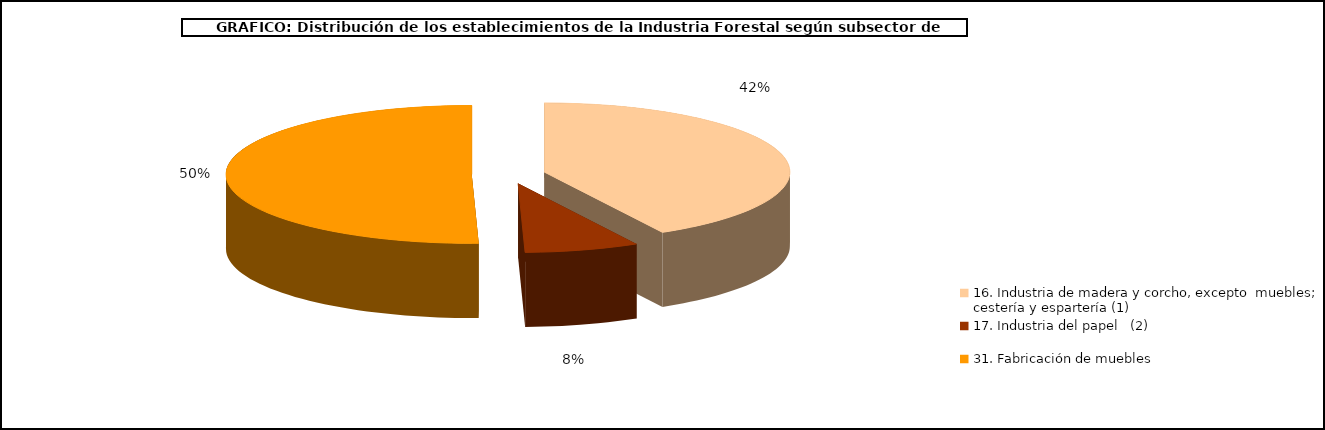
| Category | Series 0 |
|---|---|
| 16. Industria de madera y corcho, excepto  muebles; cestería y espartería (1) | 42.001 |
| 17. Industria del papel   (2) | 7.547 |
| 31. Fabricación de muebles  | 50.453 |